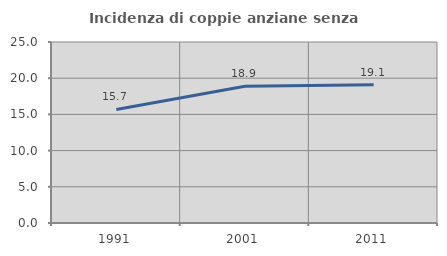
| Category | Incidenza di coppie anziane senza figli  |
|---|---|
| 1991.0 | 15.679 |
| 2001.0 | 18.898 |
| 2011.0 | 19.091 |